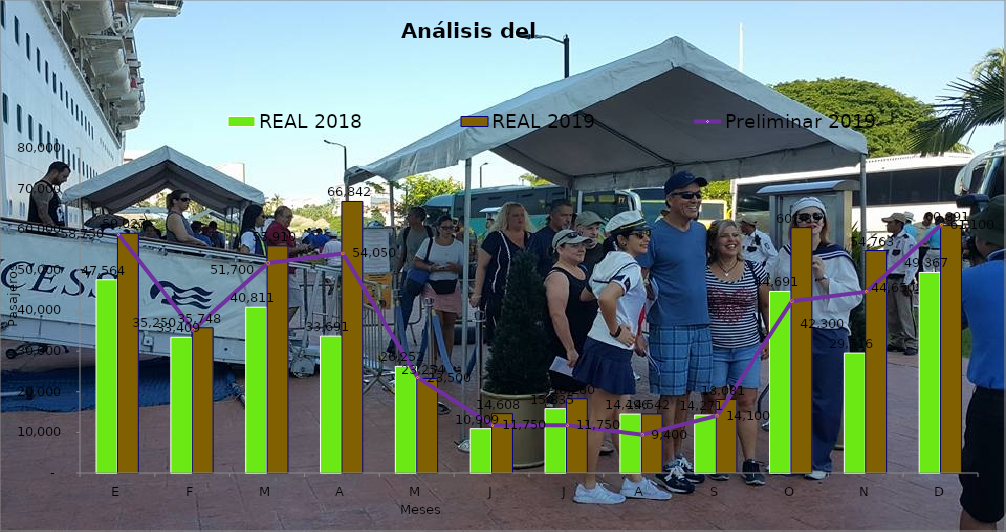
| Category | REAL 2018 | REAL 2019 |
|---|---|---|
| E | 47564 | 59027 |
| F | 33409 | 35748 |
| M | 40811 | 55910 |
| A | 33691 | 66842 |
| M | 26252 | 23254 |
| J | 10909 | 14608 |
| J | 15835 | 18280 |
| A | 14496 | 14542 |
| S | 14271 | 18081 |
| O | 44691 | 60389 |
| N | 29516 | 54763 |
| D | 49367 | 60891 |